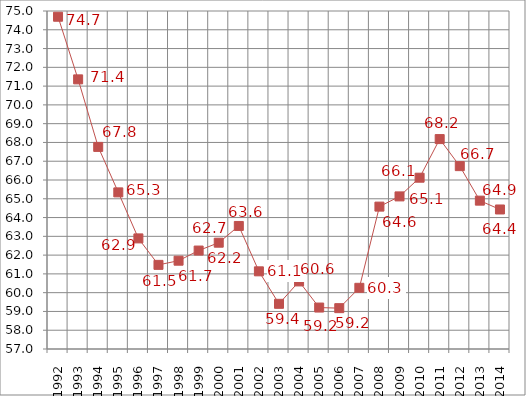
| Category | Series 0 | Series 1 |
|---|---|---|
| 1992.0 | 1992 | 74.694 |
| 1993.0 | 1993 | 71.359 |
| 1994.0 | 1994 | 67.762 |
| 1995.0 | 1995 | 65.341 |
| 1996.0 | 1996 | 62.89 |
| 1997.0 | 1997 | 61.48 |
| 1998.0 | 1998 | 61.703 |
| 1999.0 | 1999 | 62.242 |
| 2000.0 | 2000 | 62.661 |
| 2001.0 | 2001 | 63.552 |
| 2002.0 | 2002 | 61.136 |
| 2003.0 | 2003 | 59.406 |
| 2004.0 | 2004 | 60.599 |
| 2005.0 | 2005 | 59.207 |
| 2006.0 | 2006 | 59.175 |
| 2007.0 | 2007 | 60.259 |
| 2008.0 | 2008 | 64.582 |
| 2009.0 | 2009 | 65.127 |
| 2010.0 | 2010 | 66.122 |
| 2011.0 | 2011 | 68.179 |
| 2012.0 | 2012 | 66.739 |
| 2013.0 | 2013 | 64.9 |
| 2014.0 | 2014 | 64.43 |